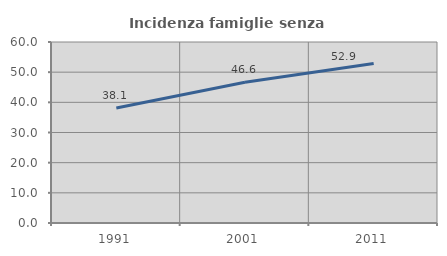
| Category | Incidenza famiglie senza nuclei |
|---|---|
| 1991.0 | 38.144 |
| 2001.0 | 46.632 |
| 2011.0 | 52.89 |